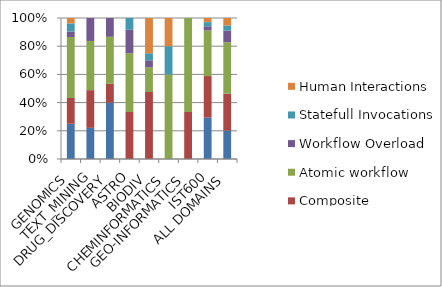
| Category | Internal macro | Composite workflows | Atomic workflow | Workflow Overload | Statefull Invocations | Human Interactions |
|---|---|---|---|---|---|---|
| GENOMICS | 26 | 19 | 45 | 4 | 6 | 4 |
| TEXT_MINING | 19 | 23 | 30 | 14 | 0 | 0 |
| DRUG_DISCOVERY | 6 | 2 | 5 | 2 | 0 | 0 |
| ASTRO | 0 | 4 | 5 | 2 | 1 | 0 |
| BIODIV | 0 | 19 | 7 | 2 | 2 | 10 |
| CHEMINFORMATICS | 0 | 0 | 3 | 0 | 1 | 1 |
| GEO-INFORMATICS | 0 | 2 | 4 | 0 | 0 | 0 |
| IST600 | 10 | 10 | 11 | 1 | 1 | 1 |
| ALL DOMAINS | 61 | 79 | 110 | 25 | 11 | 16 |